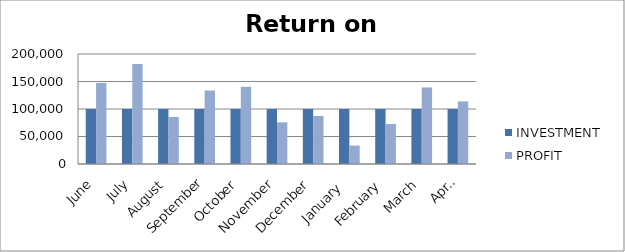
| Category | INVESTMENT  | PROFIT |
|---|---|---|
| June | 100000 | 147454 |
| July | 100000 | 181784 |
| August | 100000 | 85543 |
| September | 100000 | 133590 |
| October | 100000 | 140368 |
| November | 100000 | 75780 |
| December | 100000 | 87377 |
| January  | 100000 | 33435 |
| February | 100000 | 72800 |
| March | 100000 | 139150 |
| April | 100000 | 113802 |